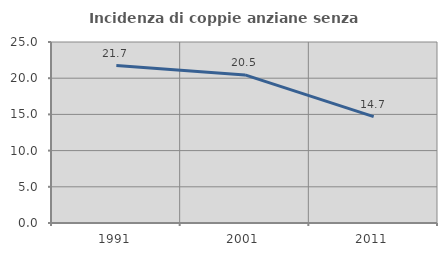
| Category | Incidenza di coppie anziane senza figli  |
|---|---|
| 1991.0 | 21.739 |
| 2001.0 | 20.455 |
| 2011.0 | 14.689 |